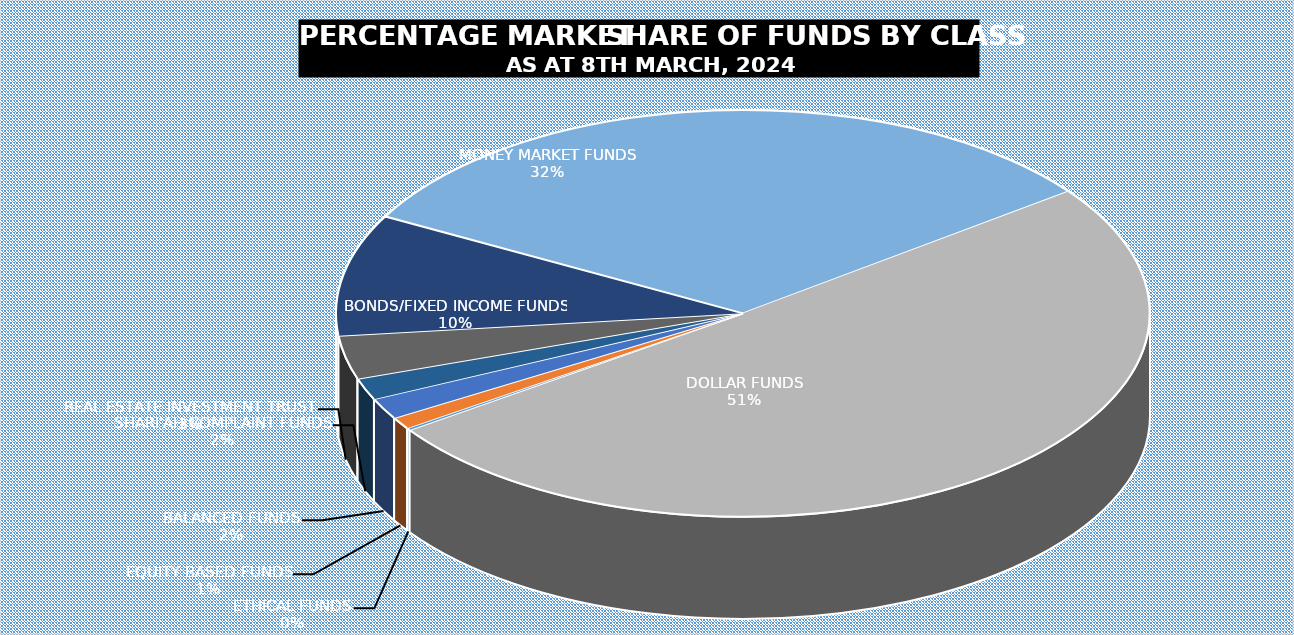
| Category | 8-Mar |
|---|---|
| ETHICAL FUNDS | 5090348734.1 |
| EQUITY BASED FUNDS | 27049856478.82 |
| BALANCED FUNDS | 48553395375.676 |
| SHARI'AH COMPLAINT FUNDS | 49747304277.799 |
| REAL ESTATE INVESTMENT TRUST | 99778864135.11 |
| BONDS/FIXED INCOME FUNDS | 279125520198.896 |
| MONEY MARKET FUNDS | 920625552385.951 |
| DOLLAR FUNDS | 1459704501021.913 |